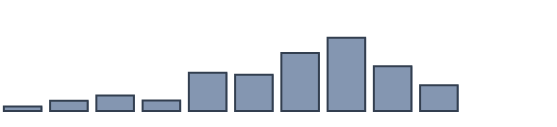
| Category | Series 0 |
|---|---|
| 0 | 1.4 |
| 1 | 3.2 |
| 2 | 4.9 |
| 3 | 3.3 |
| 4 | 12.1 |
| 5 | 11.4 |
| 6 | 18.3 |
| 7 | 23.1 |
| 8 | 14.1 |
| 9 | 8.1 |
| 10 | 0 |
| 11 | 0 |